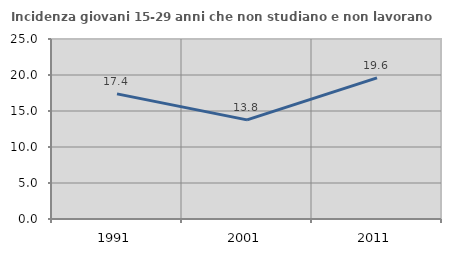
| Category | Incidenza giovani 15-29 anni che non studiano e non lavorano  |
|---|---|
| 1991.0 | 17.377 |
| 2001.0 | 13.77 |
| 2011.0 | 19.605 |